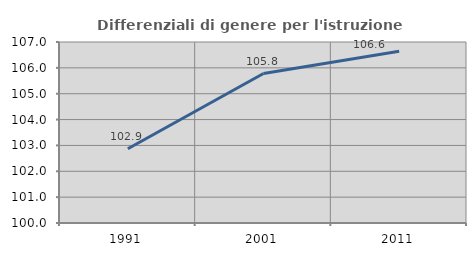
| Category | Differenziali di genere per l'istruzione superiore |
|---|---|
| 1991.0 | 102.872 |
| 2001.0 | 105.78 |
| 2011.0 | 106.638 |